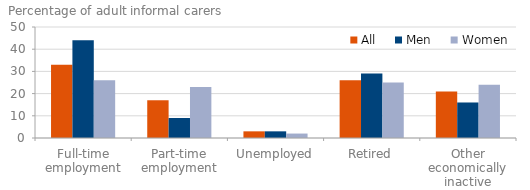
| Category | All | Men | Women |
|---|---|---|---|
| 0 | 33 | 44 | 26 |
| 1 | 17 | 9 | 23 |
| 2 | 3 | 3 | 2 |
| 3 | 26 | 29 | 25 |
| 4 | 21 | 16 | 24 |